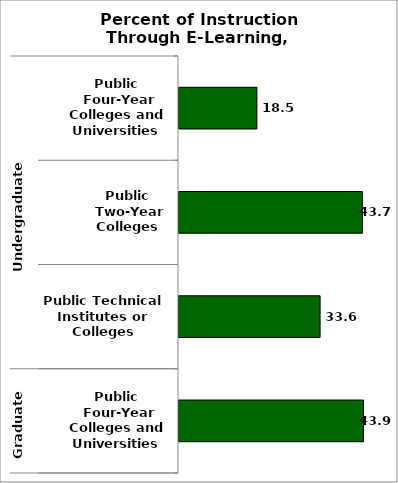
| Category | State |
|---|---|
| 0 | 18.545 |
| 1 | 43.659 |
| 2 | 33.591 |
| 3 | 43.92 |